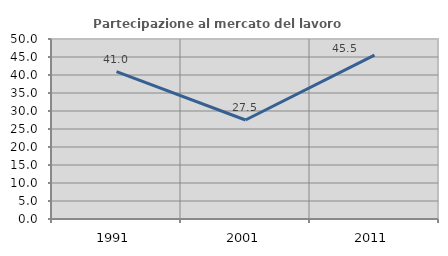
| Category | Partecipazione al mercato del lavoro  femminile |
|---|---|
| 1991.0 | 40.963 |
| 2001.0 | 27.5 |
| 2011.0 | 45.508 |